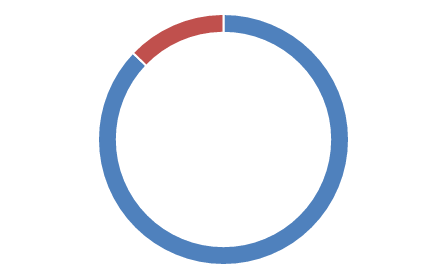
| Category | Series 0 |
|---|---|
| 0 | 61 |
| 1 | 9 |